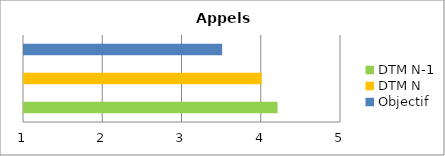
| Category | Series 0 |
|---|---|
| DTM N-1 | 4.2 |
| DTM N | 4 |
| Objectif | 3.5 |